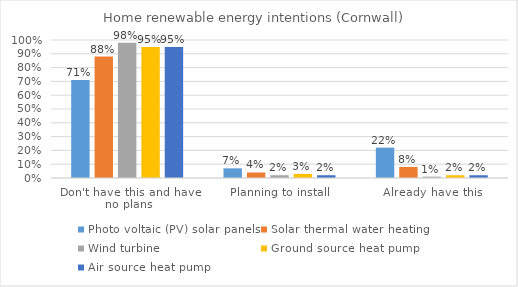
| Category | Photo voltaic (PV) solar panels | Solar thermal water heating | Wind turbine | Ground source heat pump | Air source heat pump |
|---|---|---|---|---|---|
| Don't have this and have no plans | 0.71 | 0.88 | 0.98 | 0.95 | 0.95 |
| Planning to install | 0.07 | 0.04 | 0.02 | 0.03 | 0.02 |
| Already have this | 0.22 | 0.08 | 0.01 | 0.02 | 0.02 |